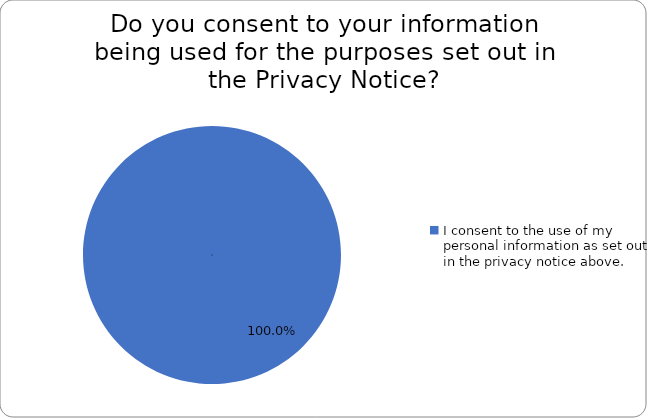
| Category | Series 0 |
|---|---|
| I consent to the use of my personal information as set out in the privacy notice above. | 1 |